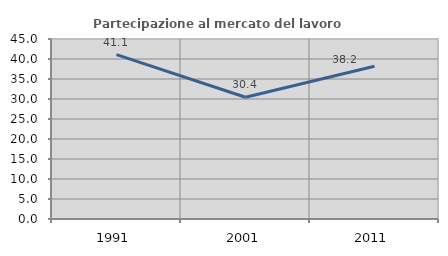
| Category | Partecipazione al mercato del lavoro  femminile |
|---|---|
| 1991.0 | 41.095 |
| 2001.0 | 30.429 |
| 2011.0 | 38.193 |